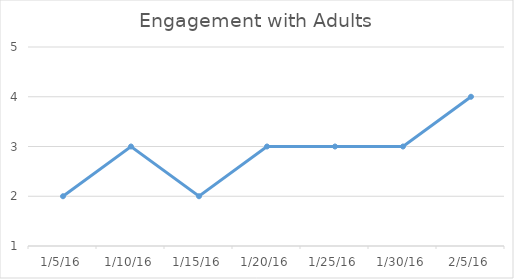
| Category | Series 0 |
|---|---|
| 1/5/16 | 2 |
| 1/10/16 | 3 |
| 1/15/16 | 2 |
| 1/20/16 | 3 |
| 1/25/16 | 3 |
| 1/30/16 | 3 |
| 2/5/16 | 4 |